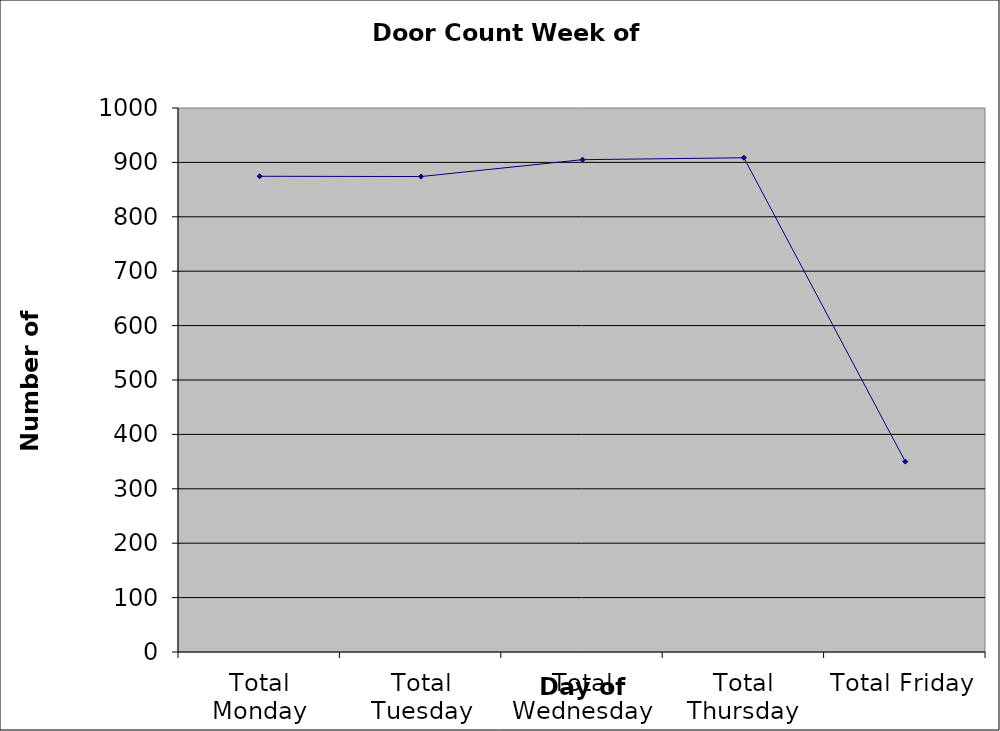
| Category | Series 0 |
|---|---|
| Total Monday | 874.5 |
| Total Tuesday | 874 |
| Total Wednesday | 905 |
| Total Thursday | 908.5 |
| Total Friday | 350 |